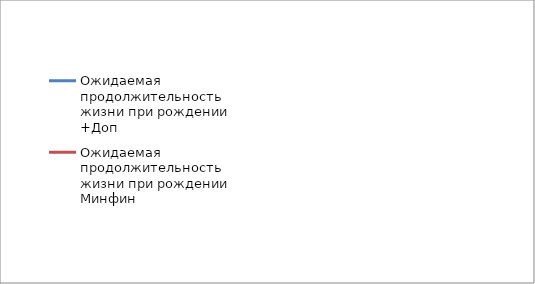
| Category | Ожидаемая продолжительность жизни при рождении +Доп | Ожидаемая продолжительность жизни при рождении Минфин |
|---|---|---|
| 2011.0 | 70.3 | 70.3 |
| 2012.0 | 70.9 | 70.9 |
| 2013.0 | 71.6 | 71.6 |
| 2014.0 | 72.2 | 72.2 |
| 2015.0 | 72.7 | 72.7 |
| 2016.0 | 73.3 | 72.9 |
| 2017.0 | 74 | 73.3 |
| 2018.0 | 74.1 | 73.2 |
| 2019.0 | 74.8 | 73.2 |
| 2020.0 | 75.5 | 73.2 |